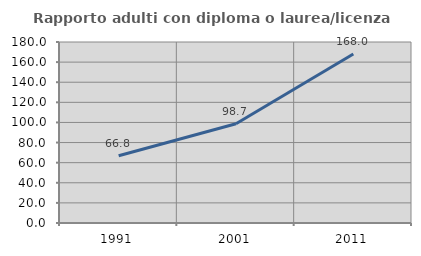
| Category | Rapporto adulti con diploma o laurea/licenza media  |
|---|---|
| 1991.0 | 66.842 |
| 2001.0 | 98.718 |
| 2011.0 | 168 |